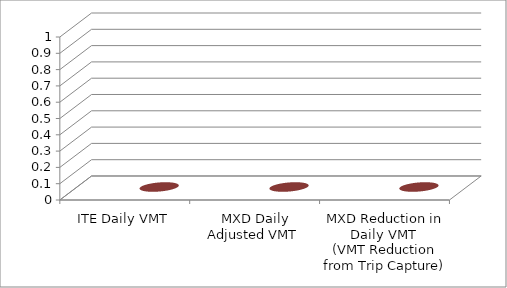
| Category | Series 0 | Series 1 |
|---|---|---|
| ITE Daily VMT |  | 0 |
| MXD Daily Adjusted VMT  |  | 0 |
| MXD Reduction in Daily VMT 
(VMT Reduction from Trip Capture) |  | 0 |